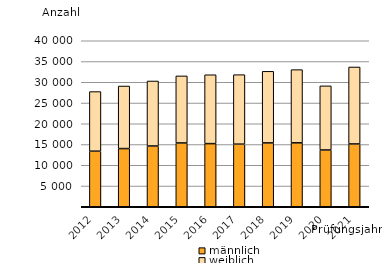
| Category | männlich  | weiblich |
|---|---|---|
| 2012.0 | 13386 | 14368 |
| 2013.0 | 14020 | 15074 |
| 2014.0 | 14638 | 15664 |
| 2015.0 | 15371 | 16161 |
| 2016.0 | 15214 | 16594 |
| 2017.0 | 15080 | 16747 |
| 2018.0 | 15386 | 17250 |
| 2019.0 | 15405 | 17637 |
| 2020.0 | 13676 | 15456 |
| 2021.0 | 15134 | 18547 |